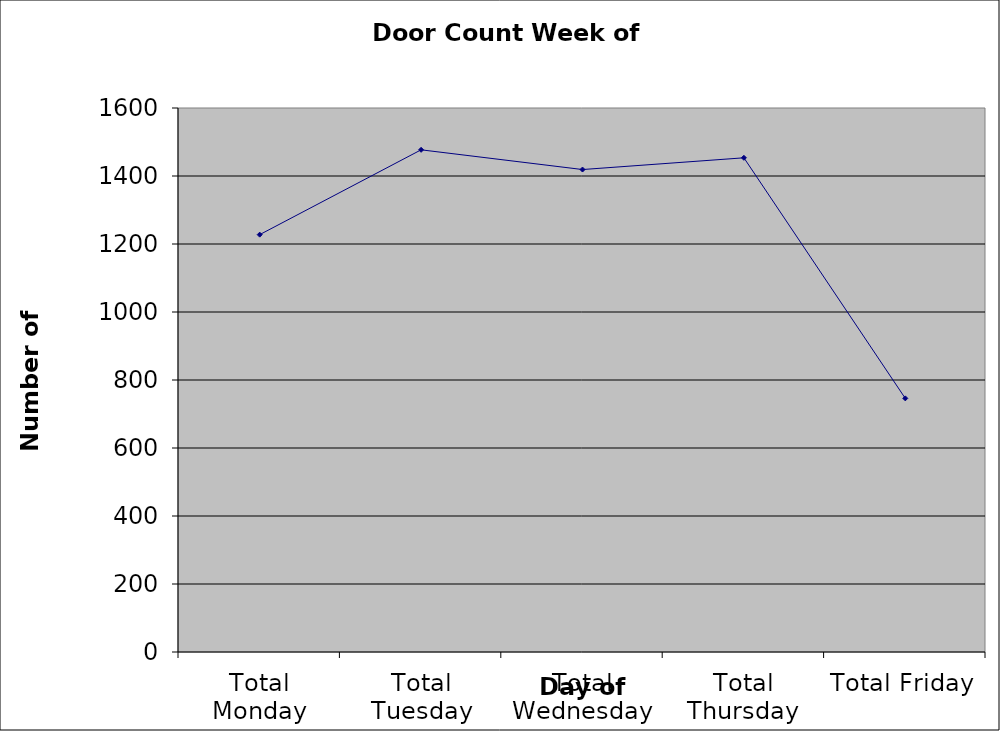
| Category | Series 0 |
|---|---|
| Total Monday | 1227.5 |
| Total Tuesday | 1477 |
| Total Wednesday | 1419 |
| Total Thursday | 1453.5 |
| Total Friday | 746 |